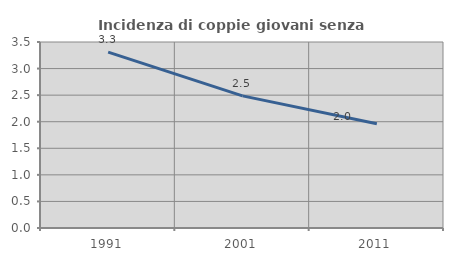
| Category | Incidenza di coppie giovani senza figli |
|---|---|
| 1991.0 | 3.31 |
| 2001.0 | 2.486 |
| 2011.0 | 1.961 |